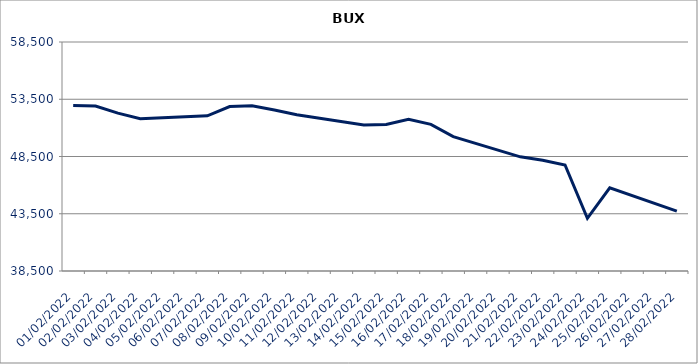
| Category | Series 0 |
|---|---|
| 01/02/2022 | 52959.27 |
| 02/02/2022 | 52910.14 |
| 03/02/2022 | 52284.64 |
| 04/02/2022 | 51806.4 |
| 07/02/2022 | 52054.67 |
| 08/02/2022 | 52861.48 |
| 09/02/2022 | 52930.3 |
| 10/02/2022 | 52566.76 |
| 11/02/2022 | 52141.58 |
| 14/02/2022 | 51262 |
| 15/02/2022 | 51295.36 |
| 16/02/2022 | 51756.19 |
| 17/02/2022 | 51305.38 |
| 18/02/2022 | 50237.2 |
| 21/02/2022 | 48470.72 |
| 22/02/2022 | 48177.46 |
| 23/02/2022 | 47762.14 |
| 24/02/2022 | 43102.34 |
| 25/02/2022 | 45769.16 |
| 28/02/2022 | 43731.25 |